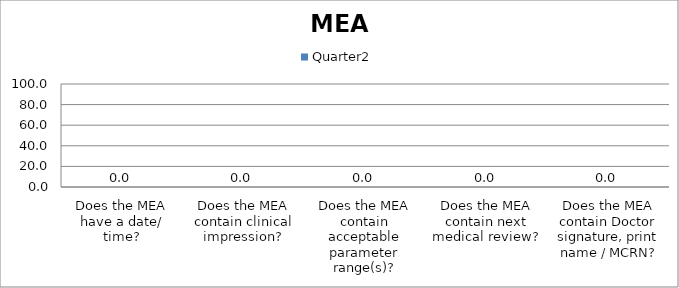
| Category | Quarter2 |
|---|---|
| Does the MEA have a date/ time? | 0 |
| Does the MEA contain clinical impression? | 0 |
| Does the MEA contain acceptable parameter range(s)? | 0 |
| Does the MEA contain next medical review? | 0 |
| Does the MEA contain Doctor signature, print name / MCRN? | 0 |